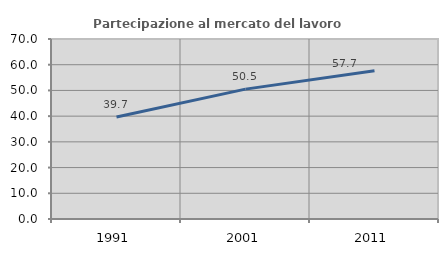
| Category | Partecipazione al mercato del lavoro  femminile |
|---|---|
| 1991.0 | 39.7 |
| 2001.0 | 50.505 |
| 2011.0 | 57.687 |